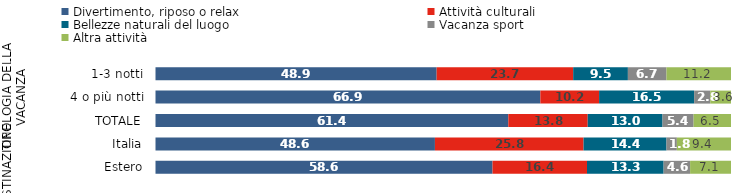
| Category | Divertimento, riposo o relax                 | Attività culturali | Bellezze naturali del luogo          | Vacanza sport                                 | Altra attività            |
|---|---|---|---|---|---|
| 0 | 48.9 | 23.7 | 9.5 | 6.7 | 11.2 |
| 1 | 66.9 | 10.2 | 16.5 | 2.8 | 3.6 |
| 2 | 61.4 | 13.8 | 13 | 5.4 | 6.5 |
| 3 | 48.6 | 25.8 | 14.4 | 1.8 | 9.4 |
| 4 | 58.6 | 16.4 | 13.3 | 4.6 | 7.1 |